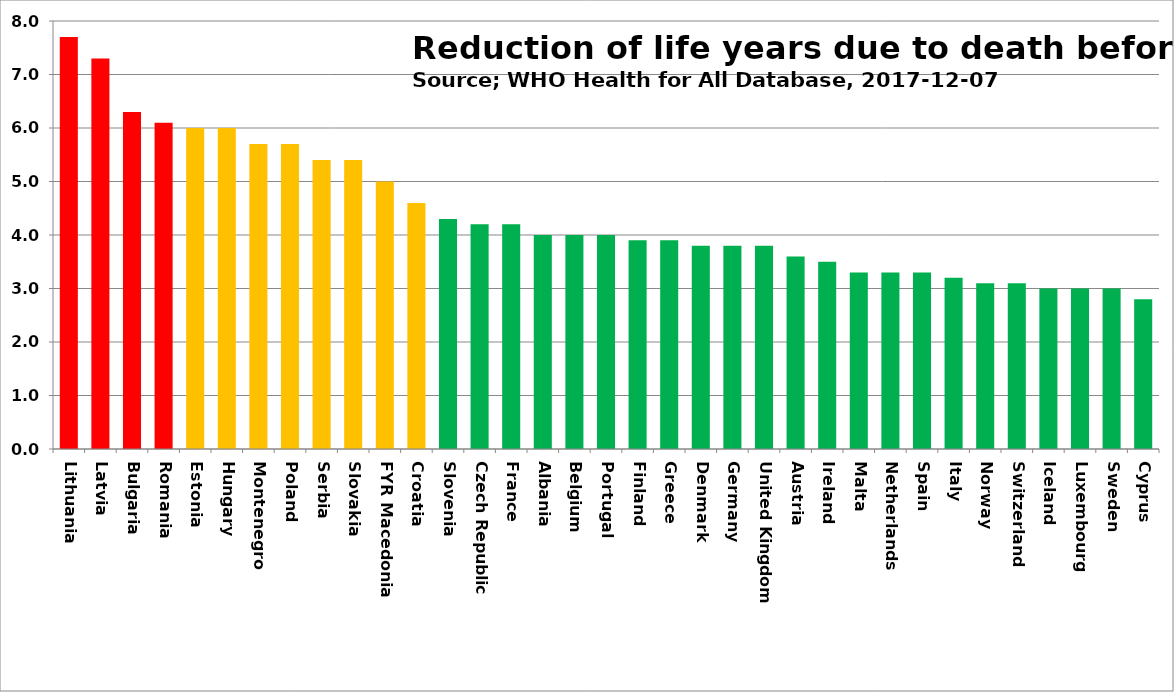
| Category | Series 0 |
|---|---|
| Lithuania | 7.7 |
| Latvia | 7.3 |
| Bulgaria | 6.3 |
| Romania | 6.1 |
| Estonia | 6 |
| Hungary | 6 |
| Montenegro | 5.7 |
| Poland | 5.7 |
| Serbia | 5.4 |
| Slovakia | 5.4 |
| FYR Macedonia | 5 |
| Croatia | 4.6 |
| Slovenia | 4.3 |
| Czech Republic | 4.2 |
| France | 4.2 |
| Albania | 4 |
| Belgium | 4 |
| Portugal | 4 |
| Finland | 3.9 |
| Greece | 3.9 |
| Denmark | 3.8 |
| Germany | 3.8 |
| United Kingdom | 3.8 |
| Austria | 3.6 |
| Ireland | 3.5 |
| Malta | 3.3 |
| Netherlands | 3.3 |
| Spain | 3.3 |
| Italy | 3.2 |
| Norway | 3.1 |
| Switzerland | 3.1 |
| Iceland | 3 |
| Luxembourg | 3 |
| Sweden | 3 |
| Cyprus | 2.8 |